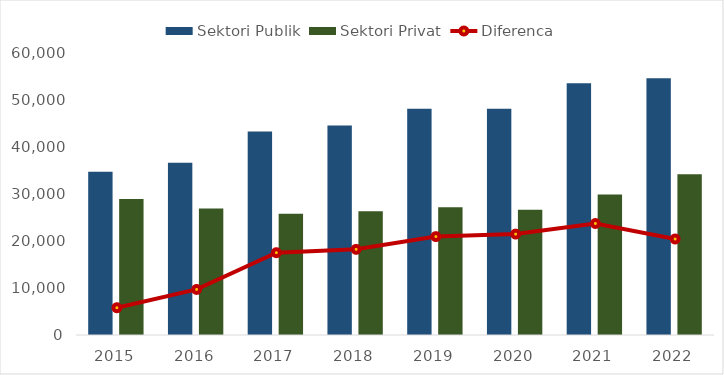
| Category | Sektori Publik | Sektori Privat |
|---|---|---|
| 2015.0 | 34719.095 | 28916.875 |
| 2016.0 | 36638.072 | 26940.942 |
| 2017.0 | 43294.781 | 25779.135 |
| 2018.0 | 44560.28 | 26336.278 |
| 2019.0 | 48131.043 | 27196.159 |
| 2020.0 | 48116.306 | 26646.077 |
| 2021.0 | 53588.47 | 29867.376 |
| 2022.0 | 54611.138 | 34188.491 |